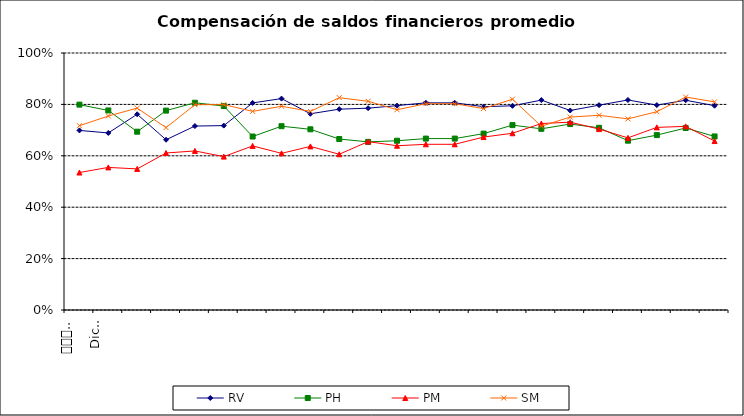
| Category | RV | PH | PM | SM |
|---|---|---|---|---|
| 0 | 0.699 | 0.799 | 0.535 | 0.717 |
| 1 | 0.689 | 0.776 | 0.555 | 0.755 |
| 2 | 0.762 | 0.694 | 0.549 | 0.786 |
| 3 | 0.662 | 0.776 | 0.611 | 0.71 |
| 4 | 0.716 | 0.806 | 0.619 | 0.799 |
| 5 | 0.718 | 0.794 | 0.597 | 0.799 |
| 6 | 0.806 | 0.675 | 0.638 | 0.773 |
| 7 | 0.823 | 0.715 | 0.61 | 0.793 |
| 8 | 0.764 | 0.703 | 0.637 | 0.773 |
| 9 | 0.781 | 0.665 | 0.606 | 0.826 |
| 10 | 0.785 | 0.654 | 0.655 | 0.812 |
| 11 | 0.795 | 0.659 | 0.639 | 0.779 |
| 12 | 0.806 | 0.667 | 0.645 | 0.803 |
| 13 | 0.806 | 0.667 | 0.645 | 0.803 |
| 14 | 0.791 | 0.686 | 0.673 | 0.784 |
| 15 | 0.794 | 0.719 | 0.688 | 0.82 |
| 16 | 0.817 | 0.705 | 0.726 | 0.715 |
| 17 | 0.776 | 0.724 | 0.731 | 0.751 |
| 18 | 0.797 | 0.709 | 0.704 | 0.758 |
| 19 | 0.817 | 0.659 | 0.67 | 0.744 |
| 20 | 0.797 | 0.681 | 0.711 | 0.772 |
| 21 | 0.816 | 0.708 | 0.715 | 0.829 |
| 22 | 0.795 | 0.675 | 0.657 | 0.81 |